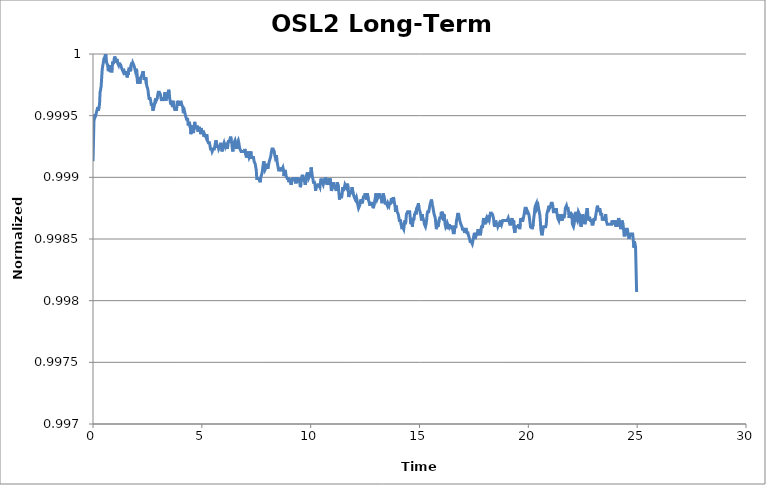
| Category | OSL2 Long-Term Stability |
|---|---|
| 0.0 | 0.999 |
| 0.025 | 0.999 |
| 0.05 | 1 |
| 0.075 | 1 |
| 0.1 | 0.999 |
| 0.125 | 1 |
| 0.15 | 1 |
| 0.175 | 1 |
| 0.2 | 1 |
| 0.225 | 1 |
| 0.25 | 1 |
| 0.275 | 1 |
| 0.3 | 1 |
| 0.325 | 1 |
| 0.35 | 1 |
| 0.375 | 1 |
| 0.4 | 1 |
| 0.425 | 1 |
| 0.45 | 1 |
| 0.475 | 1 |
| 0.5 | 1 |
| 0.525 | 1 |
| 0.55 | 1 |
| 0.575 | 1 |
| 0.6 | 1 |
| 0.625 | 1 |
| 0.65 | 1 |
| 0.675 | 1 |
| 0.7 | 1 |
| 0.725 | 1 |
| 0.75 | 1 |
| 0.775 | 1 |
| 0.8 | 1 |
| 0.825 | 1 |
| 0.85 | 1 |
| 0.875 | 1 |
| 0.9 | 1 |
| 0.925 | 1 |
| 0.95 | 1 |
| 0.975 | 1 |
| 1.0 | 1 |
| 1.025 | 1 |
| 1.05 | 1 |
| 1.075 | 1 |
| 1.1 | 1 |
| 1.125 | 1 |
| 1.15 | 1 |
| 1.175 | 1 |
| 1.2 | 1 |
| 1.225 | 1 |
| 1.25 | 1 |
| 1.275 | 1 |
| 1.3 | 1 |
| 1.325 | 1 |
| 1.35 | 1 |
| 1.375 | 1 |
| 1.4 | 1 |
| 1.425 | 1 |
| 1.45 | 1 |
| 1.475 | 1 |
| 1.5 | 1 |
| 1.525 | 1 |
| 1.55 | 1 |
| 1.575 | 1 |
| 1.6 | 1 |
| 1.625 | 1 |
| 1.65 | 1 |
| 1.675 | 1 |
| 1.7 | 1 |
| 1.725 | 1 |
| 1.75 | 1 |
| 1.775 | 1 |
| 1.8 | 1 |
| 1.825 | 1 |
| 1.85 | 1 |
| 1.875 | 1 |
| 1.9 | 1 |
| 1.925 | 1 |
| 1.95 | 1 |
| 1.975 | 1 |
| 2.0 | 1 |
| 2.025 | 1 |
| 2.05 | 1 |
| 2.075 | 1 |
| 2.1 | 1 |
| 2.125 | 1 |
| 2.15 | 1 |
| 2.175 | 1 |
| 2.2 | 1 |
| 2.225 | 1 |
| 2.25 | 1 |
| 2.275 | 1 |
| 2.3 | 1 |
| 2.325 | 1 |
| 2.35 | 1 |
| 2.375 | 1 |
| 2.4 | 1 |
| 2.425 | 1 |
| 2.45 | 1 |
| 2.475 | 1 |
| 2.5 | 1 |
| 2.525 | 1 |
| 2.55 | 1 |
| 2.575 | 1 |
| 2.6 | 1 |
| 2.625 | 1 |
| 2.65 | 1 |
| 2.675 | 1 |
| 2.7 | 1 |
| 2.725 | 1 |
| 2.75 | 1 |
| 2.775 | 1 |
| 2.8 | 1 |
| 2.825 | 1 |
| 2.85 | 1 |
| 2.875 | 1 |
| 2.9 | 1 |
| 2.925 | 1 |
| 2.95 | 1 |
| 2.975 | 1 |
| 3.0 | 1 |
| 3.025 | 1 |
| 3.05 | 1 |
| 3.075 | 1 |
| 3.1 | 1 |
| 3.125 | 1 |
| 3.15 | 1 |
| 3.175 | 1 |
| 3.2 | 1 |
| 3.225 | 1 |
| 3.25 | 1 |
| 3.275 | 1 |
| 3.3 | 1 |
| 3.325 | 1 |
| 3.35 | 1 |
| 3.375 | 1 |
| 3.4 | 1 |
| 3.425 | 1 |
| 3.45 | 1 |
| 3.475 | 1 |
| 3.5 | 1 |
| 3.525 | 1 |
| 3.55 | 1 |
| 3.575 | 1 |
| 3.6 | 1 |
| 3.625 | 1 |
| 3.65 | 1 |
| 3.675 | 1 |
| 3.7 | 1 |
| 3.725 | 1 |
| 3.75 | 1 |
| 3.775 | 1 |
| 3.8 | 1 |
| 3.825 | 1 |
| 3.85 | 1 |
| 3.875 | 1 |
| 3.9 | 1 |
| 3.925 | 1 |
| 3.95 | 1 |
| 3.975 | 1 |
| 4.0 | 1 |
| 4.025 | 1 |
| 4.05 | 1 |
| 4.075 | 1 |
| 4.1 | 1 |
| 4.125 | 1 |
| 4.15 | 1 |
| 4.175 | 1 |
| 4.2 | 1 |
| 4.225 | 1 |
| 4.25 | 1 |
| 4.275 | 1 |
| 4.3 | 0.999 |
| 4.325 | 0.999 |
| 4.35 | 0.999 |
| 4.375 | 0.999 |
| 4.4 | 0.999 |
| 4.425 | 0.999 |
| 4.45 | 0.999 |
| 4.475 | 0.999 |
| 4.5 | 0.999 |
| 4.525 | 0.999 |
| 4.55 | 0.999 |
| 4.575 | 0.999 |
| 4.6 | 0.999 |
| 4.625 | 0.999 |
| 4.65 | 0.999 |
| 4.675 | 0.999 |
| 4.7 | 0.999 |
| 4.725 | 0.999 |
| 4.75 | 0.999 |
| 4.775 | 0.999 |
| 4.8 | 0.999 |
| 4.825 | 0.999 |
| 4.85 | 0.999 |
| 4.875 | 0.999 |
| 4.9 | 0.999 |
| 4.925 | 0.999 |
| 4.95 | 0.999 |
| 4.975 | 0.999 |
| 5.0 | 0.999 |
| 5.025 | 0.999 |
| 5.05 | 0.999 |
| 5.075 | 0.999 |
| 5.1 | 0.999 |
| 5.125 | 0.999 |
| 5.15 | 0.999 |
| 5.175 | 0.999 |
| 5.2 | 0.999 |
| 5.225 | 0.999 |
| 5.25 | 0.999 |
| 5.275 | 0.999 |
| 5.3 | 0.999 |
| 5.325 | 0.999 |
| 5.35 | 0.999 |
| 5.375 | 0.999 |
| 5.4 | 0.999 |
| 5.425 | 0.999 |
| 5.45 | 0.999 |
| 5.475 | 0.999 |
| 5.5 | 0.999 |
| 5.525 | 0.999 |
| 5.55 | 0.999 |
| 5.575 | 0.999 |
| 5.6 | 0.999 |
| 5.625 | 0.999 |
| 5.65 | 0.999 |
| 5.675 | 0.999 |
| 5.7 | 0.999 |
| 5.725 | 0.999 |
| 5.75 | 0.999 |
| 5.775 | 0.999 |
| 5.8 | 0.999 |
| 5.825 | 0.999 |
| 5.85 | 0.999 |
| 5.875 | 0.999 |
| 5.9 | 0.999 |
| 5.925 | 0.999 |
| 5.95 | 0.999 |
| 5.975 | 0.999 |
| 6.0 | 0.999 |
| 6.025 | 0.999 |
| 6.05 | 0.999 |
| 6.075 | 0.999 |
| 6.1 | 0.999 |
| 6.125 | 0.999 |
| 6.15 | 0.999 |
| 6.175 | 0.999 |
| 6.2 | 0.999 |
| 6.225 | 0.999 |
| 6.25 | 0.999 |
| 6.275 | 0.999 |
| 6.3 | 0.999 |
| 6.325 | 0.999 |
| 6.35 | 0.999 |
| 6.375 | 0.999 |
| 6.4 | 0.999 |
| 6.425 | 0.999 |
| 6.45 | 0.999 |
| 6.475 | 0.999 |
| 6.5 | 0.999 |
| 6.525 | 0.999 |
| 6.55 | 0.999 |
| 6.575 | 0.999 |
| 6.6 | 0.999 |
| 6.625 | 0.999 |
| 6.65 | 0.999 |
| 6.675 | 0.999 |
| 6.7 | 0.999 |
| 6.725 | 0.999 |
| 6.75 | 0.999 |
| 6.775 | 0.999 |
| 6.8 | 0.999 |
| 6.825 | 0.999 |
| 6.85 | 0.999 |
| 6.875 | 0.999 |
| 6.9 | 0.999 |
| 6.925 | 0.999 |
| 6.95 | 0.999 |
| 6.975 | 0.999 |
| 7.0 | 0.999 |
| 7.025 | 0.999 |
| 7.05 | 0.999 |
| 7.075 | 0.999 |
| 7.1 | 0.999 |
| 7.125 | 0.999 |
| 7.15 | 0.999 |
| 7.175 | 0.999 |
| 7.2 | 0.999 |
| 7.225 | 0.999 |
| 7.25 | 0.999 |
| 7.275 | 0.999 |
| 7.3 | 0.999 |
| 7.325 | 0.999 |
| 7.35 | 0.999 |
| 7.375 | 0.999 |
| 7.4 | 0.999 |
| 7.425 | 0.999 |
| 7.45 | 0.999 |
| 7.475 | 0.999 |
| 7.5 | 0.999 |
| 7.525 | 0.999 |
| 7.55 | 0.999 |
| 7.575 | 0.999 |
| 7.6 | 0.999 |
| 7.625 | 0.999 |
| 7.65 | 0.999 |
| 7.675 | 0.999 |
| 7.7 | 0.999 |
| 7.725 | 0.999 |
| 7.75 | 0.999 |
| 7.775 | 0.999 |
| 7.8 | 0.999 |
| 7.825 | 0.999 |
| 7.85 | 0.999 |
| 7.875 | 0.999 |
| 7.9 | 0.999 |
| 7.925 | 0.999 |
| 7.95 | 0.999 |
| 7.975 | 0.999 |
| 8.0 | 0.999 |
| 8.025 | 0.999 |
| 8.05 | 0.999 |
| 8.075 | 0.999 |
| 8.1 | 0.999 |
| 8.125 | 0.999 |
| 8.15 | 0.999 |
| 8.175 | 0.999 |
| 8.2 | 0.999 |
| 8.225 | 0.999 |
| 8.25 | 0.999 |
| 8.275 | 0.999 |
| 8.3 | 0.999 |
| 8.325 | 0.999 |
| 8.35 | 0.999 |
| 8.375 | 0.999 |
| 8.4 | 0.999 |
| 8.425 | 0.999 |
| 8.45 | 0.999 |
| 8.475 | 0.999 |
| 8.5 | 0.999 |
| 8.525 | 0.999 |
| 8.55 | 0.999 |
| 8.575 | 0.999 |
| 8.6 | 0.999 |
| 8.625 | 0.999 |
| 8.65 | 0.999 |
| 8.675 | 0.999 |
| 8.7 | 0.999 |
| 8.725 | 0.999 |
| 8.75 | 0.999 |
| 8.775 | 0.999 |
| 8.8 | 0.999 |
| 8.825 | 0.999 |
| 8.85 | 0.999 |
| 8.875 | 0.999 |
| 8.9 | 0.999 |
| 8.925 | 0.999 |
| 8.95 | 0.999 |
| 8.975 | 0.999 |
| 9.0 | 0.999 |
| 9.025 | 0.999 |
| 9.05 | 0.999 |
| 9.075 | 0.999 |
| 9.1 | 0.999 |
| 9.125 | 0.999 |
| 9.15 | 0.999 |
| 9.175 | 0.999 |
| 9.2 | 0.999 |
| 9.225 | 0.999 |
| 9.25 | 0.999 |
| 9.275 | 0.999 |
| 9.3 | 0.999 |
| 9.325 | 0.999 |
| 9.35 | 0.999 |
| 9.375 | 0.999 |
| 9.4 | 0.999 |
| 9.425 | 0.999 |
| 9.45 | 0.999 |
| 9.475 | 0.999 |
| 9.5 | 0.999 |
| 9.525 | 0.999 |
| 9.55 | 0.999 |
| 9.575 | 0.999 |
| 9.6 | 0.999 |
| 9.625 | 0.999 |
| 9.65 | 0.999 |
| 9.675 | 0.999 |
| 9.7 | 0.999 |
| 9.725 | 0.999 |
| 9.75 | 0.999 |
| 9.775 | 0.999 |
| 9.8 | 0.999 |
| 9.825 | 0.999 |
| 9.85 | 0.999 |
| 9.875 | 0.999 |
| 9.9 | 0.999 |
| 9.925 | 0.999 |
| 9.95 | 0.999 |
| 9.975 | 0.999 |
| 10.0 | 0.999 |
| 10.025 | 0.999 |
| 10.05 | 0.999 |
| 10.075 | 0.999 |
| 10.1 | 0.999 |
| 10.125 | 0.999 |
| 10.15 | 0.999 |
| 10.175 | 0.999 |
| 10.2 | 0.999 |
| 10.225 | 0.999 |
| 10.25 | 0.999 |
| 10.275 | 0.999 |
| 10.3 | 0.999 |
| 10.325 | 0.999 |
| 10.35 | 0.999 |
| 10.375 | 0.999 |
| 10.4 | 0.999 |
| 10.425 | 0.999 |
| 10.45 | 0.999 |
| 10.475 | 0.999 |
| 10.5 | 0.999 |
| 10.525 | 0.999 |
| 10.55 | 0.999 |
| 10.575 | 0.999 |
| 10.6 | 0.999 |
| 10.625 | 0.999 |
| 10.65 | 0.999 |
| 10.675 | 0.999 |
| 10.7 | 0.999 |
| 10.725 | 0.999 |
| 10.75 | 0.999 |
| 10.775 | 0.999 |
| 10.8 | 0.999 |
| 10.825 | 0.999 |
| 10.85 | 0.999 |
| 10.875 | 0.999 |
| 10.9 | 0.999 |
| 10.925 | 0.999 |
| 10.95 | 0.999 |
| 10.975 | 0.999 |
| 11.0 | 0.999 |
| 11.025 | 0.999 |
| 11.05 | 0.999 |
| 11.075 | 0.999 |
| 11.1 | 0.999 |
| 11.125 | 0.999 |
| 11.15 | 0.999 |
| 11.175 | 0.999 |
| 11.2 | 0.999 |
| 11.225 | 0.999 |
| 11.25 | 0.999 |
| 11.275 | 0.999 |
| 11.3 | 0.999 |
| 11.325 | 0.999 |
| 11.35 | 0.999 |
| 11.375 | 0.999 |
| 11.4 | 0.999 |
| 11.425 | 0.999 |
| 11.45 | 0.999 |
| 11.475 | 0.999 |
| 11.5 | 0.999 |
| 11.525 | 0.999 |
| 11.55 | 0.999 |
| 11.575 | 0.999 |
| 11.6 | 0.999 |
| 11.625 | 0.999 |
| 11.65 | 0.999 |
| 11.675 | 0.999 |
| 11.7 | 0.999 |
| 11.725 | 0.999 |
| 11.75 | 0.999 |
| 11.775 | 0.999 |
| 11.8 | 0.999 |
| 11.825 | 0.999 |
| 11.85 | 0.999 |
| 11.875 | 0.999 |
| 11.9 | 0.999 |
| 11.925 | 0.999 |
| 11.95 | 0.999 |
| 11.975 | 0.999 |
| 12.0 | 0.999 |
| 12.025 | 0.999 |
| 12.05 | 0.999 |
| 12.075 | 0.999 |
| 12.1 | 0.999 |
| 12.125 | 0.999 |
| 12.15 | 0.999 |
| 12.175 | 0.999 |
| 12.2 | 0.999 |
| 12.225 | 0.999 |
| 12.25 | 0.999 |
| 12.275 | 0.999 |
| 12.3 | 0.999 |
| 12.325 | 0.999 |
| 12.35 | 0.999 |
| 12.375 | 0.999 |
| 12.4 | 0.999 |
| 12.425 | 0.999 |
| 12.45 | 0.999 |
| 12.475 | 0.999 |
| 12.5 | 0.999 |
| 12.525 | 0.999 |
| 12.55 | 0.999 |
| 12.575 | 0.999 |
| 12.6 | 0.999 |
| 12.625 | 0.999 |
| 12.65 | 0.999 |
| 12.675 | 0.999 |
| 12.7 | 0.999 |
| 12.725 | 0.999 |
| 12.75 | 0.999 |
| 12.775 | 0.999 |
| 12.8 | 0.999 |
| 12.825 | 0.999 |
| 12.85 | 0.999 |
| 12.875 | 0.999 |
| 12.9 | 0.999 |
| 12.925 | 0.999 |
| 12.95 | 0.999 |
| 12.975 | 0.999 |
| 13.0 | 0.999 |
| 13.025 | 0.999 |
| 13.05 | 0.999 |
| 13.075 | 0.999 |
| 13.1 | 0.999 |
| 13.125 | 0.999 |
| 13.15 | 0.999 |
| 13.175 | 0.999 |
| 13.2 | 0.999 |
| 13.225 | 0.999 |
| 13.25 | 0.999 |
| 13.275 | 0.999 |
| 13.3 | 0.999 |
| 13.325 | 0.999 |
| 13.35 | 0.999 |
| 13.375 | 0.999 |
| 13.4 | 0.999 |
| 13.425 | 0.999 |
| 13.45 | 0.999 |
| 13.475 | 0.999 |
| 13.5 | 0.999 |
| 13.525 | 0.999 |
| 13.55 | 0.999 |
| 13.575 | 0.999 |
| 13.6 | 0.999 |
| 13.625 | 0.999 |
| 13.65 | 0.999 |
| 13.675 | 0.999 |
| 13.7 | 0.999 |
| 13.725 | 0.999 |
| 13.75 | 0.999 |
| 13.775 | 0.999 |
| 13.8 | 0.999 |
| 13.825 | 0.999 |
| 13.85 | 0.999 |
| 13.875 | 0.999 |
| 13.9 | 0.999 |
| 13.925 | 0.999 |
| 13.95 | 0.999 |
| 13.975 | 0.999 |
| 14.0 | 0.999 |
| 14.025 | 0.999 |
| 14.05 | 0.999 |
| 14.075 | 0.999 |
| 14.1 | 0.999 |
| 14.125 | 0.999 |
| 14.15 | 0.999 |
| 14.175 | 0.999 |
| 14.2 | 0.999 |
| 14.225 | 0.999 |
| 14.25 | 0.999 |
| 14.275 | 0.999 |
| 14.3 | 0.999 |
| 14.325 | 0.999 |
| 14.35 | 0.999 |
| 14.375 | 0.999 |
| 14.4 | 0.999 |
| 14.425 | 0.999 |
| 14.45 | 0.999 |
| 14.475 | 0.999 |
| 14.5 | 0.999 |
| 14.525 | 0.999 |
| 14.55 | 0.999 |
| 14.575 | 0.999 |
| 14.6 | 0.999 |
| 14.625 | 0.999 |
| 14.65 | 0.999 |
| 14.675 | 0.999 |
| 14.7 | 0.999 |
| 14.725 | 0.999 |
| 14.75 | 0.999 |
| 14.775 | 0.999 |
| 14.8 | 0.999 |
| 14.825 | 0.999 |
| 14.85 | 0.999 |
| 14.875 | 0.999 |
| 14.9 | 0.999 |
| 14.925 | 0.999 |
| 14.95 | 0.999 |
| 14.975 | 0.999 |
| 15.0 | 0.999 |
| 15.025 | 0.999 |
| 15.05 | 0.999 |
| 15.075 | 0.999 |
| 15.1 | 0.999 |
| 15.125 | 0.999 |
| 15.15 | 0.999 |
| 15.175 | 0.999 |
| 15.2 | 0.999 |
| 15.225 | 0.999 |
| 15.25 | 0.999 |
| 15.275 | 0.999 |
| 15.3 | 0.999 |
| 15.325 | 0.999 |
| 15.35 | 0.999 |
| 15.375 | 0.999 |
| 15.4 | 0.999 |
| 15.425 | 0.999 |
| 15.45 | 0.999 |
| 15.475 | 0.999 |
| 15.5 | 0.999 |
| 15.525 | 0.999 |
| 15.55 | 0.999 |
| 15.575 | 0.999 |
| 15.6 | 0.999 |
| 15.625 | 0.999 |
| 15.65 | 0.999 |
| 15.675 | 0.999 |
| 15.7 | 0.999 |
| 15.725 | 0.999 |
| 15.75 | 0.999 |
| 15.775 | 0.999 |
| 15.8 | 0.999 |
| 15.825 | 0.999 |
| 15.85 | 0.999 |
| 15.875 | 0.999 |
| 15.9 | 0.999 |
| 15.925 | 0.999 |
| 15.95 | 0.999 |
| 15.975 | 0.999 |
| 16.0 | 0.999 |
| 16.025 | 0.999 |
| 16.05 | 0.999 |
| 16.075 | 0.999 |
| 16.1 | 0.999 |
| 16.125 | 0.999 |
| 16.15 | 0.999 |
| 16.175 | 0.999 |
| 16.2 | 0.999 |
| 16.225 | 0.999 |
| 16.25 | 0.999 |
| 16.275 | 0.999 |
| 16.3 | 0.999 |
| 16.325 | 0.999 |
| 16.35 | 0.999 |
| 16.375 | 0.999 |
| 16.4 | 0.999 |
| 16.425 | 0.999 |
| 16.45 | 0.999 |
| 16.475 | 0.999 |
| 16.5 | 0.999 |
| 16.525 | 0.999 |
| 16.55 | 0.999 |
| 16.575 | 0.999 |
| 16.6 | 0.999 |
| 16.625 | 0.999 |
| 16.65 | 0.999 |
| 16.675 | 0.999 |
| 16.7 | 0.999 |
| 16.725 | 0.999 |
| 16.75 | 0.999 |
| 16.775 | 0.999 |
| 16.8 | 0.999 |
| 16.825 | 0.999 |
| 16.85 | 0.999 |
| 16.875 | 0.999 |
| 16.9 | 0.999 |
| 16.925 | 0.999 |
| 16.95 | 0.999 |
| 16.975 | 0.999 |
| 17.0 | 0.999 |
| 17.025 | 0.999 |
| 17.05 | 0.999 |
| 17.075 | 0.999 |
| 17.1 | 0.999 |
| 17.125 | 0.999 |
| 17.15 | 0.999 |
| 17.175 | 0.999 |
| 17.2 | 0.999 |
| 17.225 | 0.999 |
| 17.25 | 0.999 |
| 17.275 | 0.999 |
| 17.3 | 0.998 |
| 17.325 | 0.998 |
| 17.35 | 0.998 |
| 17.375 | 0.998 |
| 17.4 | 0.998 |
| 17.425 | 0.998 |
| 17.45 | 0.998 |
| 17.475 | 0.998 |
| 17.5 | 0.999 |
| 17.525 | 0.999 |
| 17.55 | 0.998 |
| 17.575 | 0.998 |
| 17.6 | 0.999 |
| 17.625 | 0.999 |
| 17.65 | 0.999 |
| 17.675 | 0.999 |
| 17.7 | 0.999 |
| 17.725 | 0.999 |
| 17.75 | 0.999 |
| 17.775 | 0.999 |
| 17.8 | 0.999 |
| 17.825 | 0.999 |
| 17.85 | 0.999 |
| 17.875 | 0.999 |
| 17.9 | 0.999 |
| 17.925 | 0.999 |
| 17.95 | 0.999 |
| 17.975 | 0.999 |
| 18.0 | 0.999 |
| 18.025 | 0.999 |
| 18.05 | 0.999 |
| 18.075 | 0.999 |
| 18.1 | 0.999 |
| 18.125 | 0.999 |
| 18.15 | 0.999 |
| 18.175 | 0.999 |
| 18.2 | 0.999 |
| 18.225 | 0.999 |
| 18.25 | 0.999 |
| 18.275 | 0.999 |
| 18.3 | 0.999 |
| 18.325 | 0.999 |
| 18.35 | 0.999 |
| 18.375 | 0.999 |
| 18.4 | 0.999 |
| 18.425 | 0.999 |
| 18.45 | 0.999 |
| 18.475 | 0.999 |
| 18.5 | 0.999 |
| 18.525 | 0.999 |
| 18.55 | 0.999 |
| 18.575 | 0.999 |
| 18.6 | 0.999 |
| 18.625 | 0.999 |
| 18.65 | 0.999 |
| 18.675 | 0.999 |
| 18.7 | 0.999 |
| 18.725 | 0.999 |
| 18.75 | 0.999 |
| 18.775 | 0.999 |
| 18.8 | 0.999 |
| 18.825 | 0.999 |
| 18.85 | 0.999 |
| 18.875 | 0.999 |
| 18.9 | 0.999 |
| 18.925 | 0.999 |
| 18.95 | 0.999 |
| 18.975 | 0.999 |
| 19.0 | 0.999 |
| 19.025 | 0.999 |
| 19.05 | 0.999 |
| 19.075 | 0.999 |
| 19.1 | 0.999 |
| 19.125 | 0.999 |
| 19.15 | 0.999 |
| 19.175 | 0.999 |
| 19.2 | 0.999 |
| 19.225 | 0.999 |
| 19.25 | 0.999 |
| 19.275 | 0.999 |
| 19.3 | 0.999 |
| 19.325 | 0.999 |
| 19.35 | 0.999 |
| 19.375 | 0.999 |
| 19.4 | 0.999 |
| 19.425 | 0.999 |
| 19.45 | 0.999 |
| 19.475 | 0.999 |
| 19.5 | 0.999 |
| 19.525 | 0.999 |
| 19.55 | 0.999 |
| 19.575 | 0.999 |
| 19.6 | 0.999 |
| 19.625 | 0.999 |
| 19.65 | 0.999 |
| 19.675 | 0.999 |
| 19.7 | 0.999 |
| 19.725 | 0.999 |
| 19.75 | 0.999 |
| 19.775 | 0.999 |
| 19.8 | 0.999 |
| 19.825 | 0.999 |
| 19.85 | 0.999 |
| 19.875 | 0.999 |
| 19.9 | 0.999 |
| 19.925 | 0.999 |
| 19.95 | 0.999 |
| 19.975 | 0.999 |
| 20.0 | 0.999 |
| 20.025 | 0.999 |
| 20.05 | 0.999 |
| 20.075 | 0.999 |
| 20.1 | 0.999 |
| 20.125 | 0.999 |
| 20.15 | 0.999 |
| 20.175 | 0.999 |
| 20.2 | 0.999 |
| 20.225 | 0.999 |
| 20.25 | 0.999 |
| 20.275 | 0.999 |
| 20.3 | 0.999 |
| 20.325 | 0.999 |
| 20.35 | 0.999 |
| 20.375 | 0.999 |
| 20.4 | 0.999 |
| 20.425 | 0.999 |
| 20.45 | 0.999 |
| 20.475 | 0.999 |
| 20.5 | 0.999 |
| 20.525 | 0.999 |
| 20.55 | 0.999 |
| 20.575 | 0.999 |
| 20.6 | 0.999 |
| 20.625 | 0.999 |
| 20.65 | 0.999 |
| 20.675 | 0.999 |
| 20.7 | 0.999 |
| 20.725 | 0.999 |
| 20.75 | 0.999 |
| 20.775 | 0.999 |
| 20.8 | 0.999 |
| 20.825 | 0.999 |
| 20.85 | 0.999 |
| 20.875 | 0.999 |
| 20.9 | 0.999 |
| 20.925 | 0.999 |
| 20.95 | 0.999 |
| 20.975 | 0.999 |
| 21.0 | 0.999 |
| 21.025 | 0.999 |
| 21.05 | 0.999 |
| 21.075 | 0.999 |
| 21.1 | 0.999 |
| 21.125 | 0.999 |
| 21.15 | 0.999 |
| 21.175 | 0.999 |
| 21.2 | 0.999 |
| 21.225 | 0.999 |
| 21.25 | 0.999 |
| 21.275 | 0.999 |
| 21.3 | 0.999 |
| 21.325 | 0.999 |
| 21.35 | 0.999 |
| 21.375 | 0.999 |
| 21.4 | 0.999 |
| 21.425 | 0.999 |
| 21.45 | 0.999 |
| 21.475 | 0.999 |
| 21.5 | 0.999 |
| 21.525 | 0.999 |
| 21.55 | 0.999 |
| 21.575 | 0.999 |
| 21.6 | 0.999 |
| 21.625 | 0.999 |
| 21.65 | 0.999 |
| 21.675 | 0.999 |
| 21.7 | 0.999 |
| 21.725 | 0.999 |
| 21.75 | 0.999 |
| 21.775 | 0.999 |
| 21.8 | 0.999 |
| 21.825 | 0.999 |
| 21.85 | 0.999 |
| 21.875 | 0.999 |
| 21.9 | 0.999 |
| 21.925 | 0.999 |
| 21.95 | 0.999 |
| 21.975 | 0.999 |
| 22.0 | 0.999 |
| 22.025 | 0.999 |
| 22.05 | 0.999 |
| 22.075 | 0.999 |
| 22.1 | 0.999 |
| 22.125 | 0.999 |
| 22.15 | 0.999 |
| 22.175 | 0.999 |
| 22.2 | 0.999 |
| 22.225 | 0.999 |
| 22.25 | 0.999 |
| 22.275 | 0.999 |
| 22.3 | 0.999 |
| 22.325 | 0.999 |
| 22.35 | 0.999 |
| 22.375 | 0.999 |
| 22.4 | 0.999 |
| 22.425 | 0.999 |
| 22.45 | 0.999 |
| 22.475 | 0.999 |
| 22.5 | 0.999 |
| 22.525 | 0.999 |
| 22.55 | 0.999 |
| 22.575 | 0.999 |
| 22.6 | 0.999 |
| 22.625 | 0.999 |
| 22.65 | 0.999 |
| 22.675 | 0.999 |
| 22.7 | 0.999 |
| 22.725 | 0.999 |
| 22.75 | 0.999 |
| 22.775 | 0.999 |
| 22.8 | 0.999 |
| 22.825 | 0.999 |
| 22.85 | 0.999 |
| 22.875 | 0.999 |
| 22.9 | 0.999 |
| 22.925 | 0.999 |
| 22.95 | 0.999 |
| 22.975 | 0.999 |
| 23.0 | 0.999 |
| 23.025 | 0.999 |
| 23.05 | 0.999 |
| 23.075 | 0.999 |
| 23.1 | 0.999 |
| 23.125 | 0.999 |
| 23.15 | 0.999 |
| 23.175 | 0.999 |
| 23.2 | 0.999 |
| 23.225 | 0.999 |
| 23.25 | 0.999 |
| 23.275 | 0.999 |
| 23.3 | 0.999 |
| 23.325 | 0.999 |
| 23.35 | 0.999 |
| 23.375 | 0.999 |
| 23.4 | 0.999 |
| 23.425 | 0.999 |
| 23.45 | 0.999 |
| 23.475 | 0.999 |
| 23.5 | 0.999 |
| 23.525 | 0.999 |
| 23.55 | 0.999 |
| 23.575 | 0.999 |
| 23.6 | 0.999 |
| 23.625 | 0.999 |
| 23.65 | 0.999 |
| 23.675 | 0.999 |
| 23.7 | 0.999 |
| 23.725 | 0.999 |
| 23.75 | 0.999 |
| 23.775 | 0.999 |
| 23.8 | 0.999 |
| 23.825 | 0.999 |
| 23.85 | 0.999 |
| 23.875 | 0.999 |
| 23.9 | 0.999 |
| 23.925 | 0.999 |
| 23.95 | 0.999 |
| 23.975 | 0.999 |
| 24.0 | 0.999 |
| 24.025 | 0.999 |
| 24.05 | 0.999 |
| 24.075 | 0.999 |
| 24.1 | 0.999 |
| 24.125 | 0.999 |
| 24.15 | 0.999 |
| 24.175 | 0.999 |
| 24.2 | 0.999 |
| 24.225 | 0.999 |
| 24.25 | 0.999 |
| 24.275 | 0.999 |
| 24.3 | 0.999 |
| 24.325 | 0.999 |
| 24.35 | 0.999 |
| 24.375 | 0.999 |
| 24.4 | 0.999 |
| 24.425 | 0.999 |
| 24.45 | 0.999 |
| 24.475 | 0.999 |
| 24.5 | 0.999 |
| 24.525 | 0.999 |
| 24.55 | 0.999 |
| 24.575 | 0.999 |
| 24.6 | 0.999 |
| 24.625 | 0.998 |
| 24.65 | 0.999 |
| 24.675 | 0.999 |
| 24.7 | 0.999 |
| 24.725 | 0.999 |
| 24.75 | 0.999 |
| 24.775 | 0.999 |
| 24.8 | 0.999 |
| 24.825 | 0.998 |
| 24.85 | 0.998 |
| 24.875 | 0.998 |
| 24.9 | 0.998 |
| 24.925 | 0.998 |
| 24.95 | 0.998 |
| 24.975 | 0.998 |